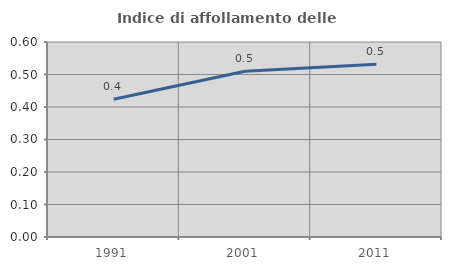
| Category | Indice di affollamento delle abitazioni  |
|---|---|
| 1991.0 | 0.424 |
| 2001.0 | 0.51 |
| 2011.0 | 0.532 |